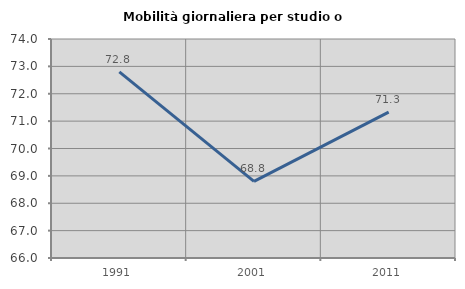
| Category | Mobilità giornaliera per studio o lavoro |
|---|---|
| 1991.0 | 72.799 |
| 2001.0 | 68.801 |
| 2011.0 | 71.331 |